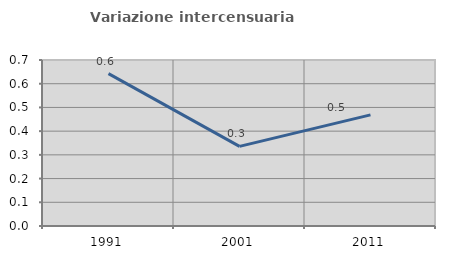
| Category | Variazione intercensuaria annua |
|---|---|
| 1991.0 | 0.643 |
| 2001.0 | 0.336 |
| 2011.0 | 0.469 |